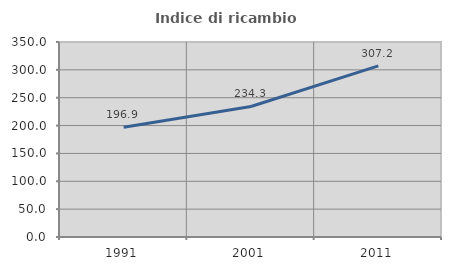
| Category | Indice di ricambio occupazionale  |
|---|---|
| 1991.0 | 196.875 |
| 2001.0 | 234.286 |
| 2011.0 | 307.207 |